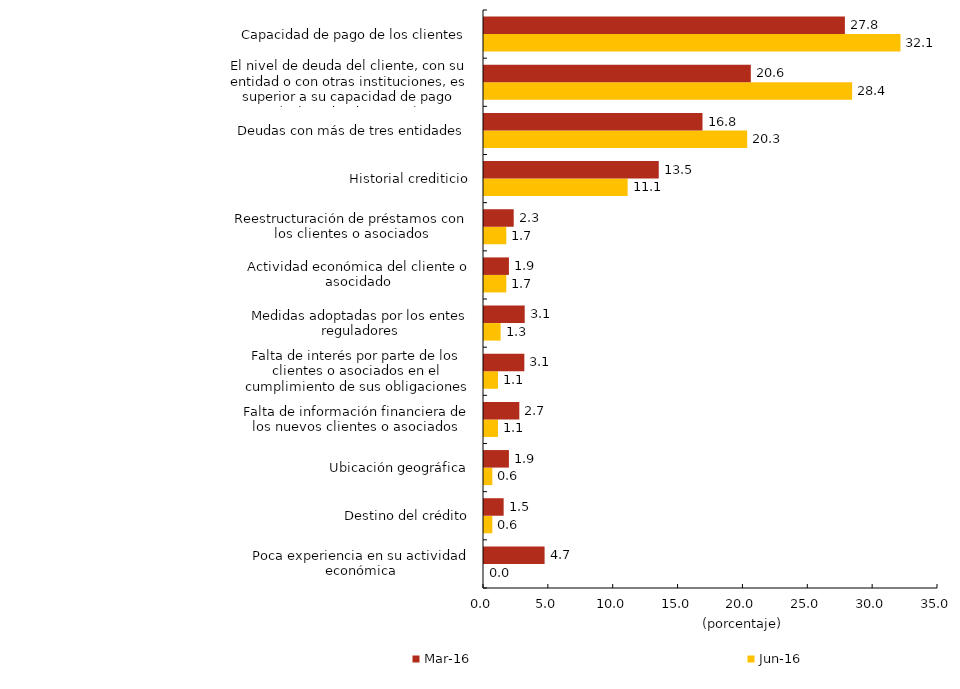
| Category | jun-16 | mar-16 |
|---|---|---|
| Poca experiencia en su actividad económica | 0 | 4.671 |
| Destino del crédito | 0.641 | 1.515 |
| Ubicación geográfica | 0.641 | 1.92 |
| Falta de información financiera de los nuevos clientes o asociados | 1.075 | 2.723 |
| Falta de interés por parte de los clientes o asociados en el cumplimiento de sus obligaciones | 1.075 | 3.111 |
| Medidas adoptadas por los entes reguladores | 1.282 | 3.139 |
| Actividad económica del cliente o asocidado | 1.716 | 1.92 |
| Reestructuración de préstamos con los clientes o asociados | 1.716 | 2.29 |
| Historial crediticio | 11.074 | 13.473 |
| Deudas con más de tres entidades | 20.29 | 16.845 |
| El nivel de deuda del cliente, con su entidad o con otras instituciones, es superior a su capacidad de pago (sobrendeudamiento) | 28.382 | 20.57 |
| Capacidad de pago de los clientes | 32.106 | 27.821 |